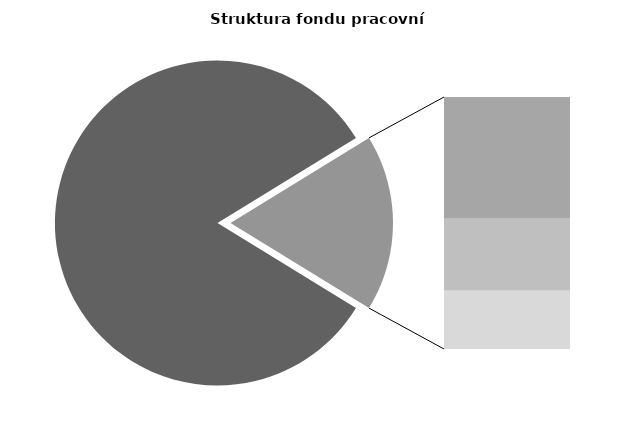
| Category | Series 0 |
|---|---|
| Průměrná měsíční odpracovaná doba bez přesčasu | 138.906 |
| Dovolená | 14.268 |
| Nemoc | 8.441 |
| Jiné | 6.838 |